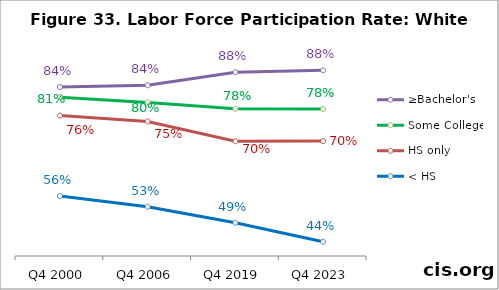
| Category | ≥Bachelor's | Some College | HS only | < HS |
|---|---|---|---|---|
| Q4 2000 | 0.837 | 0.81 | 0.763 | 0.555 |
| Q4 2006 | 0.842 | 0.797 | 0.748 | 0.528 |
| Q4 2019 | 0.875 | 0.781 | 0.697 | 0.486 |
| Q4 2023 | 0.88 | 0.78 | 0.697 | 0.437 |